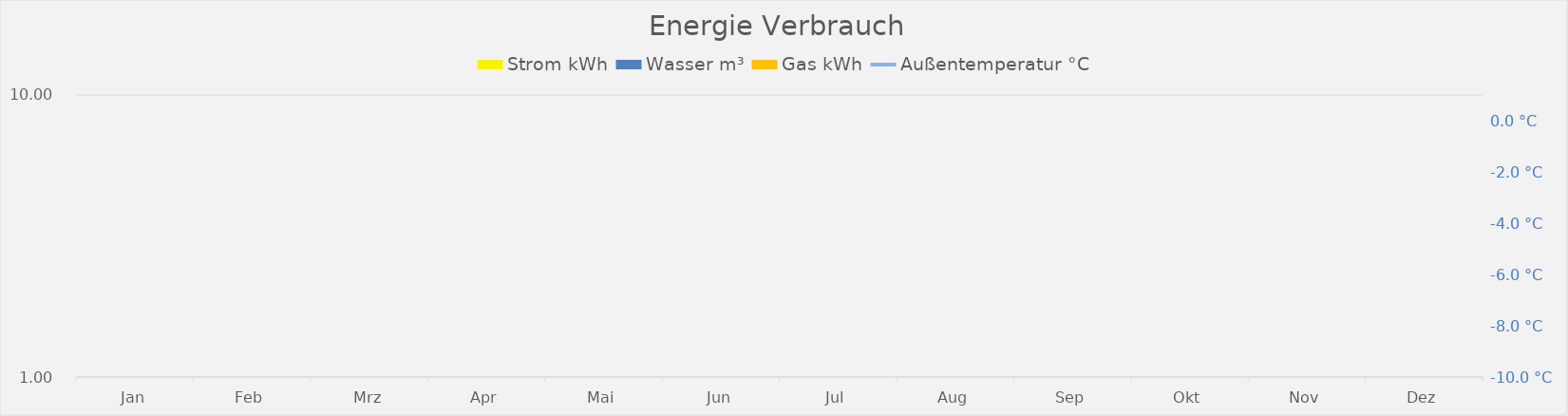
| Category | Series 0 | Strom kWh | Wasser m³ | Gas kWh |
|---|---|---|---|---|
| Jan |  | 0 | 0 | 0 |
| Feb |  | 0 | 0 | 0 |
| Mrz |  | 0 | 0 | 0 |
| Apr |  | 0 | 0 | 0 |
| Mai |  | 0 | 0 | 0 |
| Jun |  | 0 | 0 | 0 |
| Jul |  | 0 | 0 | 0 |
| Aug |  | 0 | 0 | 0 |
| Sep |  | 0 | 0 | 0 |
| Okt |  | 0 | 0 | 0 |
| Nov |  | 0 | 0 | 0 |
| Dez |  | 0 | 0 | 0 |